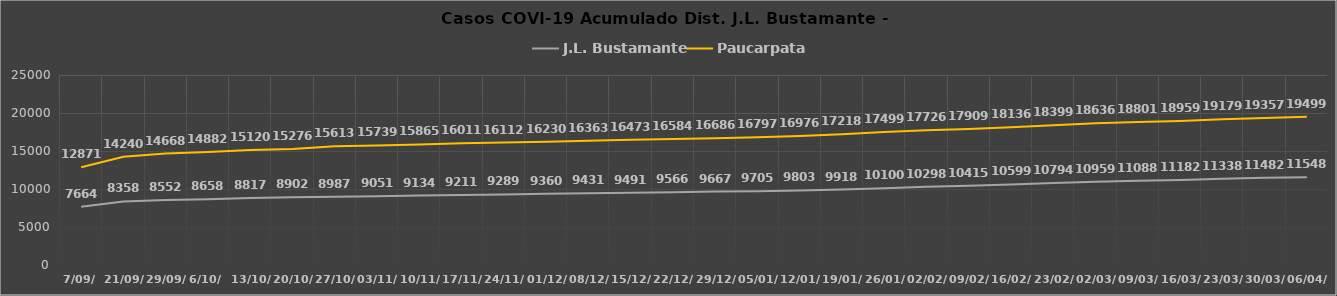
| Category | J.L. Bustamante | Paucarpata |
|---|---|---|
| 7/09/ | 7664 | 12871 |
| 21/09/ | 8358 | 14240 |
| 29/09/ | 8552 | 14668 |
| 6/10/ | 8658 | 14882 |
| 13/10/ | 8817 | 15120 |
| 20/10/ | 8902 | 15276 |
| 27/10/ | 8987 | 15613 |
| 03/11/ | 9051 | 15739 |
| 10/11/ | 9134 | 15865 |
| 17/11/ | 9211 | 16011 |
| 24/11/ | 9289 | 16112 |
| 01/12/ | 9360 | 16230 |
| 08/12/ | 9431 | 16363 |
| 15/12/ | 9491 | 16473 |
| 22/12/ | 9566 | 16584 |
| 29/12/ | 9667 | 16686 |
| 05/01/ | 9705 | 16797 |
| 12/01/ | 9803 | 16976 |
| 19/01/ | 9918 | 17218 |
| 26/01/ | 10100 | 17499 |
| 02/02/ | 10298 | 17726 |
| 09/02/ | 10415 | 17909 |
| 16/02/ | 10599 | 18136 |
| 23/02/ | 10794 | 18399 |
| 02/03/ | 10959 | 18636 |
| 09/03/ | 11088 | 18801 |
| 16/03/ | 11182 | 18959 |
| 23/03/ | 11338 | 19179 |
| 30/03/ | 11482 | 19357 |
| 06/04/ | 11548 | 19499 |